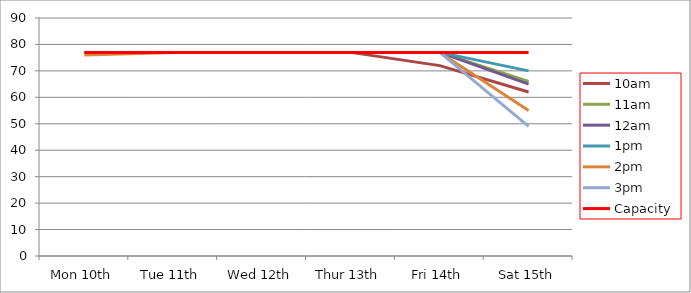
| Category | 9am | 10am | 11am | 12am | 1pm | 2pm | 3pm | 4pm | 5pm | Capacity |
|---|---|---|---|---|---|---|---|---|---|---|
| Mon 10th |  | 77 | 77 | 77 | 77 | 76 | 77 |  |  | 77 |
| Tue 11th |  | 77 | 77 | 77 | 77 | 77 | 77 |  |  | 77 |
| Wed 12th |  | 77 | 77 | 77 | 77 | 77 | 77 |  |  | 77 |
| Thur 13th |  | 77 | 77 | 77 | 77 | 77 | 77 |  |  | 77 |
| Fri 14th |  | 72 | 77 | 77 | 77 | 77 | 77 |  |  | 77 |
| Sat 15th |  | 62 | 66 | 65 | 70 | 55 | 49 |  |  | 77 |